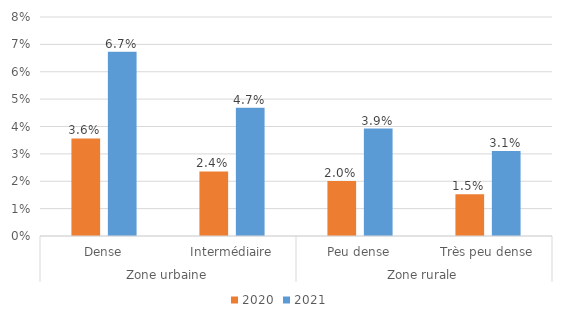
| Category | 2020 | 2021 |
|---|---|---|
| 0 | 0.036 | 0.067 |
| 1 | 0.024 | 0.047 |
| 2 | 0.02 | 0.039 |
| 3 | 0.015 | 0.031 |